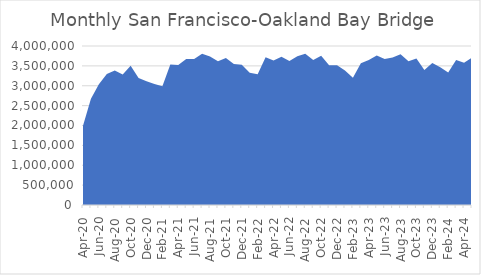
| Category | Number of Bridge Crossings |
|---|---|
| 2020-04-01 | 1996243 |
| 2020-05-01 | 2673380 |
| 2020-06-01 | 3036424 |
| 2020-07-01 | 3294706 |
| 2020-08-01 | 3382756 |
| 2020-09-01 | 3282056 |
| 2020-10-01 | 3504554 |
| 2020-11-01 | 3192647 |
| 2020-12-01 | 3111694 |
| 2021-01-01 | 3041330 |
| 2021-02-01 | 2989816 |
| 2021-03-01 | 3532498 |
| 2021-04-01 | 3522492 |
| 2021-05-01 | 3671838 |
| 2021-06-01 | 3673837 |
| 2021-07-01 | 3803940 |
| 2021-08-01 | 3737917 |
| 2021-09-01 | 3618241 |
| 2021-10-01 | 3700292 |
| 2021-11-01 | 3546027 |
| 2021-12-01 | 3529143 |
| 2022-01-01 | 3325322 |
| 2022-02-01 | 3286568 |
| 2022-03-01 | 3717879 |
| 2022-04-01 | 3634689 |
| 2022-05-01 | 3729564 |
| 2022-06-01 | 3622401 |
| 2022-07-01 | 3739359 |
| 2022-08-01 | 3803975 |
| 2022-09-01 | 3649505 |
| 2022-10-01 | 3754261 |
| 2022-11-01 | 3513877 |
| 2022-12-01 | 3513520 |
| 2023-01-01 | 3383633 |
| 2023-02-01 | 3199618 |
| 2023-03-01 | 3568295 |
| 2023-04-01 | 3649730 |
| 2023-05-01 | 3763445 |
| 2023-06-01 | 3673225 |
| 2023-07-01 | 3711557 |
| 2023-08-01 | 3795223 |
| 2023-09-01 | 3613710 |
| 2023-10-01 | 3686944 |
| 2023-11-01 | 3399365 |
| 2023-12-01 | 3573283 |
| 2024-01-01 | 3462422 |
| 2024-02-01 | 3332318 |
| 2024-03-01 | 3650729 |
| 2024-04-01 | 3578031 |
| 2024-05-01 | 3706897 |